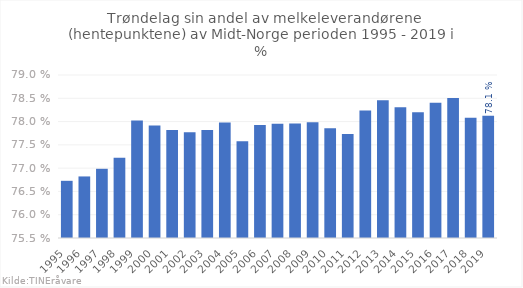
| Category | Trøndelag |
|---|---|
| 1995.0 | 0.767 |
| 1996.0 | 0.768 |
| 1997.0 | 0.77 |
| 1998.0 | 0.772 |
| 1999.0 | 0.78 |
| 2000.0 | 0.779 |
| 2001.0 | 0.778 |
| 2002.0 | 0.778 |
| 2003.0 | 0.778 |
| 2004.0 | 0.78 |
| 2005.0 | 0.776 |
| 2006.0 | 0.779 |
| 2007.0 | 0.78 |
| 2008.0 | 0.78 |
| 2009.0 | 0.78 |
| 2010.0 | 0.779 |
| 2011.0 | 0.777 |
| 2012.0 | 0.782 |
| 2013.0 | 0.785 |
| 2014.0 | 0.783 |
| 2015.0 | 0.782 |
| 2016.0 | 0.784 |
| 2017.0 | 0.785 |
| 2018.0 | 0.781 |
| 2019.0 | 0.781 |